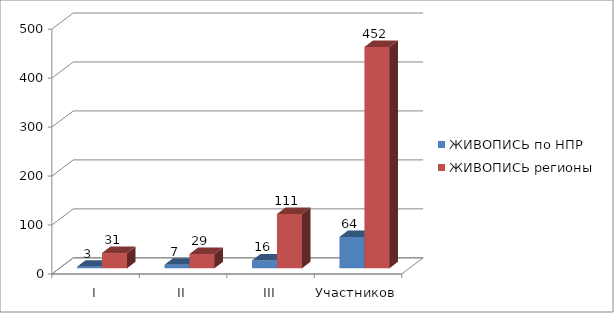
| Category | ЖИВОПИСЬ по НПР | ЖИВОПИСЬ регионы |
|---|---|---|
| I | 3 | 31 |
| II | 7 | 29 |
| III | 16 | 111 |
| Участников | 64 | 452 |